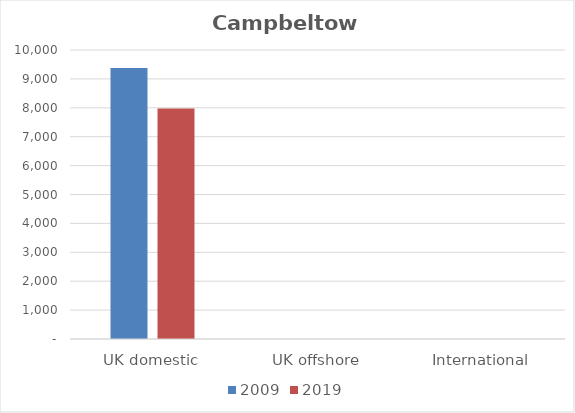
| Category | 2009 | 2019 |
|---|---|---|
| UK domestic | 9376 | 7975 |
| UK offshore | 0 | 0 |
| International | 0 | 0 |